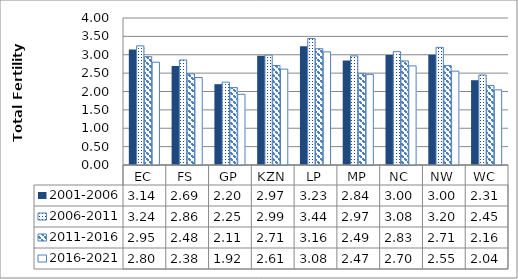
| Category | 2001-2006 | 2006-2011 | 2011-2016 | 2016-2021 |
|---|---|---|---|---|
| EC | 3.145 | 3.242 | 2.949 | 2.798 |
| FS | 2.693 | 2.857 | 2.482 | 2.38 |
| GP | 2.199 | 2.254 | 2.106 | 1.924 |
| KZN | 2.974 | 2.991 | 2.708 | 2.609 |
| LP | 3.232 | 3.442 | 3.164 | 3.078 |
| MP | 2.845 | 2.969 | 2.494 | 2.466 |
| NC | 2.995 | 3.084 | 2.832 | 2.697 |
| NW | 3.001 | 3.201 | 2.705 | 2.554 |
| WC | 2.307 | 2.449 | 2.162 | 2.045 |